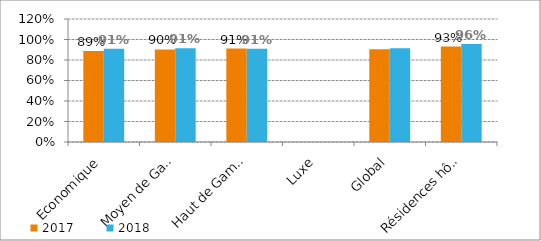
| Category | 2017 | 2018 |
|---|---|---|
| Economique | 0.889 | 0.91 |
| Moyen de Gamme | 0.903 | 0.914 |
| Haut de Gamme | 0.911 | 0.911 |
| Luxe | 0 | 0 |
| Global | 0.904 | 0.914 |
| Résidences hôtelières | 0.931 | 0.955 |